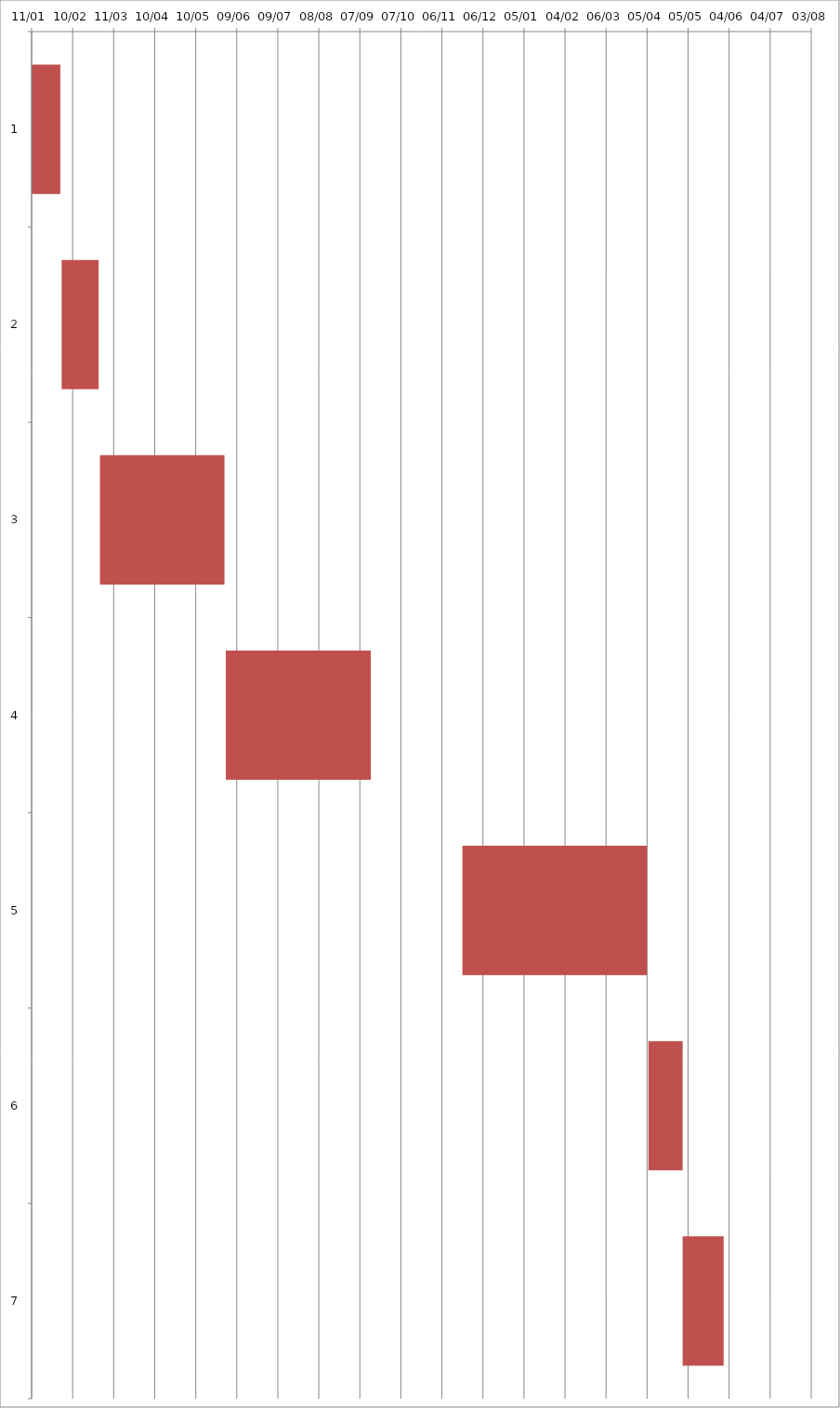
| Category | Fecha de inicio | DURACIÓN |
|---|---|---|
| 0 | 1/11/16 | 21 |
| 1 | 2/2/16 | 27 |
| 2 | 3/1/16 | 91 |
| 3 | 6/1/16 | 106 |
| 4 | 11/21/16 | 135 |
| 5 | 4/6/17 | 25 |
| 6 | 5/1/17 | 30 |